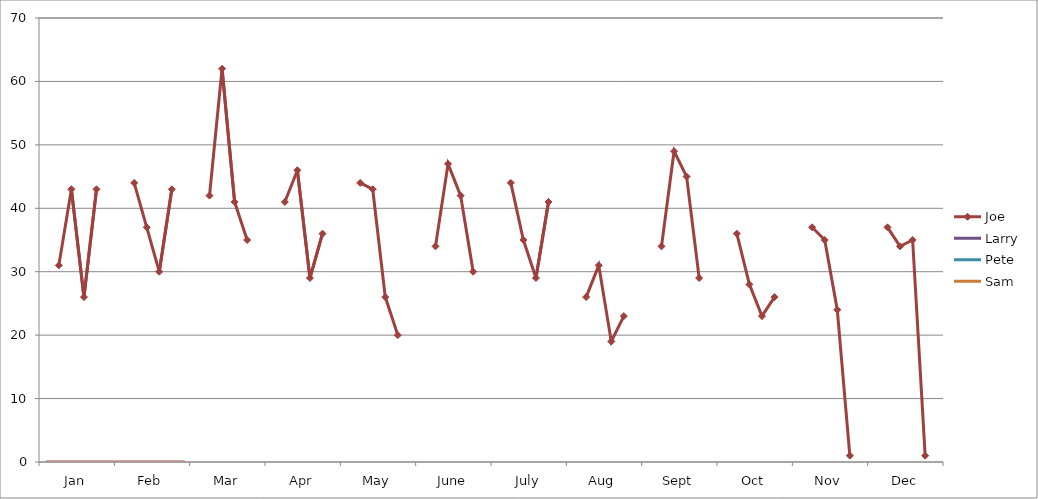
| Category | Series 0 |
|---|---|
| Jan | 0 |
| Feb | 0 |
| Mar | 0 |
| Apr | 0 |
| May | 0 |
| June | 0 |
| July | 0 |
| Aug | 0 |
| Sept | 0 |
| Oct | 0 |
| Nov | 0 |
| Dec | 0 |